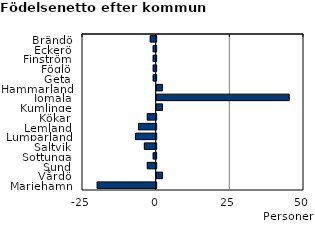
| Category | Series 0 |
|---|---|
| Brändö | -2 |
| Eckerö | -1 |
| Finström | -1 |
| Föglö | -1 |
| Geta | -1 |
| Hammarland | 2 |
| Jomala | 45 |
| Kumlinge | 2 |
| Kökar | -3 |
| Lemland | -6 |
| Lumparland | -7 |
| Saltvik | -4 |
| Sottunga | -1 |
| Sund | -3 |
| Vårdö | 2 |
| Mariehamn | -20 |